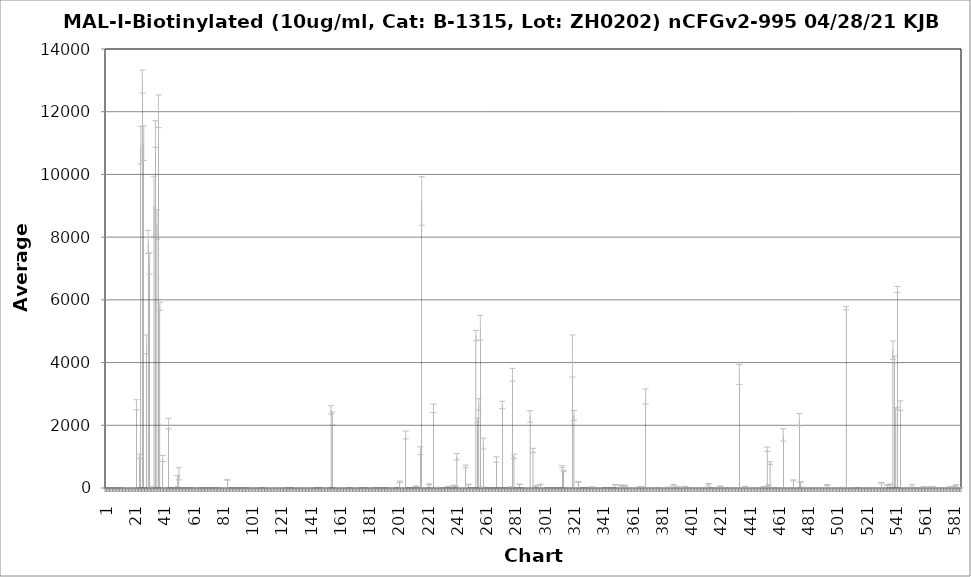
| Category | Average RFU |
|---|---|
| 1.0 | -2.5 |
| 2.0 | -8.25 |
| 3.0 | -2.75 |
| 4.0 | -7.5 |
| 5.0 | -4.25 |
| 6.0 | -10 |
| 7.0 | -8.5 |
| 8.0 | -4 |
| 9.0 | -11.75 |
| 10.0 | -9 |
| 11.0 | -9 |
| 12.0 | -2.5 |
| 13.0 | -4.75 |
| 14.0 | -1.25 |
| 15.0 | -7.5 |
| 16.0 | -4.25 |
| 17.0 | -3 |
| 18.0 | -4 |
| 19.0 | -0.75 |
| 20.0 | -0.25 |
| 21.0 | -8 |
| 22.0 | 2655.25 |
| 23.0 | -2.75 |
| 24.0 | 1009.75 |
| 25.0 | 10933.75 |
| 26.0 | 12960.75 |
| 27.0 | 10995.25 |
| 28.0 | -6.75 |
| 29.0 | 4580.25 |
| 30.0 | 7848 |
| 31.0 | 7163.5 |
| 32.0 | 32 |
| 33.0 | -5.25 |
| 34.0 | 8989 |
| 35.0 | 11289.75 |
| 36.0 | 8401.75 |
| 37.0 | 12013.5 |
| 38.0 | 5795.75 |
| 39.0 | -8.5 |
| 40.0 | 940.5 |
| 41.0 | -0.75 |
| 42.0 | -6 |
| 43.0 | -2.75 |
| 44.0 | 2054.5 |
| 45.0 | -5 |
| 46.0 | -3.75 |
| 47.0 | -8.5 |
| 48.0 | -11.75 |
| 49.0 | -7.25 |
| 50.0 | 216.5 |
| 51.0 | 452.75 |
| 52.0 | -3 |
| 53.0 | -6.75 |
| 54.0 | -4 |
| 55.0 | -7.25 |
| 56.0 | -6.75 |
| 57.0 | -15.5 |
| 58.0 | -1.25 |
| 59.0 | -4 |
| 60.0 | -12.75 |
| 61.0 | -8.5 |
| 62.0 | -5.75 |
| 63.0 | -2 |
| 64.0 | -3.5 |
| 65.0 | -3.25 |
| 66.0 | -6 |
| 67.0 | -8.25 |
| 68.0 | -3 |
| 69.0 | -4.5 |
| 70.0 | -4.5 |
| 71.0 | -2.25 |
| 72.0 | -4.75 |
| 73.0 | -12.25 |
| 74.0 | -4.25 |
| 75.0 | -7.5 |
| 76.0 | -7.25 |
| 77.0 | -6.5 |
| 78.0 | -13 |
| 79.0 | -9 |
| 80.0 | -27 |
| 81.0 | -4.75 |
| 82.0 | 2.5 |
| 83.0 | 5.25 |
| 84.0 | 258 |
| 85.0 | -13.75 |
| 86.0 | -6 |
| 87.0 | -5 |
| 88.0 | -13.25 |
| 89.0 | -8.75 |
| 90.0 | -9.25 |
| 91.0 | -10.75 |
| 92.0 | -7.5 |
| 93.0 | -9 |
| 94.0 | -10 |
| 95.0 | -12.25 |
| 96.0 | -4.75 |
| 97.0 | -2 |
| 98.0 | -2.25 |
| 99.0 | -6.5 |
| 100.0 | -5.5 |
| 101.0 | 19.5 |
| 102.0 | 1.25 |
| 103.0 | -9.5 |
| 104.0 | 1 |
| 105.0 | -7.5 |
| 106.0 | -2.75 |
| 107.0 | -14 |
| 108.0 | -2.75 |
| 109.0 | -4 |
| 110.0 | -3.5 |
| 111.0 | -214 |
| 112.0 | -0.5 |
| 113.0 | -9 |
| 114.0 | -0.5 |
| 115.0 | -16.25 |
| 116.0 | -1 |
| 117.0 | -1 |
| 118.0 | -2.5 |
| 119.0 | -17.75 |
| 120.0 | -3 |
| 121.0 | 1.5 |
| 122.0 | 0.25 |
| 123.0 | -4 |
| 124.0 | -2.75 |
| 125.0 | -4.75 |
| 126.0 | -7.25 |
| 127.0 | -4.75 |
| 128.0 | -6.75 |
| 129.0 | -4.75 |
| 130.0 | -11.25 |
| 131.0 | -3.5 |
| 132.0 | 11.5 |
| 133.0 | -4.25 |
| 134.0 | -128.75 |
| 135.0 | -7.75 |
| 136.0 | -8.25 |
| 137.0 | -0.5 |
| 138.0 | -23.25 |
| 139.0 | -5.5 |
| 140.0 | -5 |
| 141.0 | 2 |
| 142.0 | -82.5 |
| 143.0 | -5 |
| 144.0 | -2.75 |
| 145.0 | -2.25 |
| 146.0 | -5.5 |
| 147.0 | -15.5 |
| 148.0 | -4.75 |
| 149.0 | -9.25 |
| 150.0 | -5.5 |
| 151.0 | -0.25 |
| 152.0 | -2.25 |
| 153.0 | -5 |
| 154.0 | -5.5 |
| 155.0 | 2491.25 |
| 156.0 | 2225 |
| 157.0 | -7 |
| 158.0 | -6 |
| 159.0 | -4.5 |
| 160.0 | 12.75 |
| 161.0 | -1.75 |
| 162.0 | -10 |
| 163.0 | 2.5 |
| 164.0 | 1 |
| 165.0 | -39 |
| 166.0 | -6.75 |
| 167.0 | -2.75 |
| 168.0 | -3 |
| 169.0 | -3.5 |
| 170.0 | -20.25 |
| 171.0 | 0.25 |
| 172.0 | -5.75 |
| 173.0 | -5 |
| 174.0 | -1.5 |
| 175.0 | -7 |
| 176.0 | -5 |
| 177.0 | -4.5 |
| 178.0 | -11.25 |
| 179.0 | -5.5 |
| 180.0 | -8 |
| 181.0 | -7.25 |
| 182.0 | -2.25 |
| 183.0 | -6.5 |
| 184.0 | -4 |
| 185.0 | -12.75 |
| 186.0 | -8.25 |
| 187.0 | -8.25 |
| 188.0 | -140.75 |
| 189.0 | -10.75 |
| 190.0 | -7 |
| 191.0 | -4.75 |
| 192.0 | -11 |
| 193.0 | -5.5 |
| 194.0 | -26.75 |
| 195.0 | -17.75 |
| 196.0 | -8 |
| 197.0 | -3.25 |
| 198.0 | -2.5 |
| 199.0 | -3.75 |
| 200.0 | -3.75 |
| 201.0 | -40.25 |
| 202.0 | 200.5 |
| 203.0 | 0.5 |
| 204.0 | -0.5 |
| 205.0 | -5 |
| 206.0 | 1691 |
| 207.0 | -14 |
| 208.0 | -7.75 |
| 209.0 | -9.25 |
| 210.0 | -10.25 |
| 211.0 | -5.5 |
| 212.0 | -3.25 |
| 213.0 | 54.5 |
| 214.0 | -5 |
| 215.0 | -40 |
| 216.0 | 1189 |
| 217.0 | 9152.75 |
| 218.0 | -8.75 |
| 219.0 | -6.5 |
| 220.0 | -7.5 |
| 221.0 | -19.5 |
| 222.0 | 115.75 |
| 223.0 | -4 |
| 224.0 | 1.5 |
| 225.0 | 2540 |
| 226.0 | -6.25 |
| 227.0 | -4.75 |
| 228.0 | 18.25 |
| 229.0 | -9.75 |
| 230.0 | -8.75 |
| 231.0 | -9.25 |
| 232.0 | -10.5 |
| 233.0 | -13.75 |
| 234.0 | -6 |
| 235.0 | 47.5 |
| 236.0 | -5 |
| 237.0 | -7.75 |
| 238.0 | -6 |
| 239.0 | 84 |
| 240.0 | 55 |
| 241.0 | 1000.5 |
| 242.0 | -12.25 |
| 243.0 | -0.5 |
| 244.0 | -3.25 |
| 245.0 | -5.5 |
| 246.0 | 9.5 |
| 247.0 | 686.5 |
| 248.0 | -2.75 |
| 249.0 | 112.75 |
| 250.0 | -7.75 |
| 251.0 | -8.75 |
| 252.0 | -15.25 |
| 253.0 | -12.75 |
| 254.0 | 4859.5 |
| 255.0 | 2166.25 |
| 256.0 | 2662.25 |
| 257.0 | 5110 |
| 258.0 | 24.75 |
| 259.0 | 1415.25 |
| 260.0 | -5.25 |
| 261.0 | -14.75 |
| 262.0 | -12.75 |
| 263.0 | -16.75 |
| 264.0 | -14.25 |
| 265.0 | -5.75 |
| 266.0 | -10.5 |
| 267.0 | -5.75 |
| 268.0 | 907.5 |
| 269.0 | -1.5 |
| 270.0 | -7 |
| 271.0 | -5.25 |
| 272.0 | 2647.5 |
| 273.0 | -18 |
| 274.0 | -9.25 |
| 275.0 | -15.75 |
| 276.0 | -9 |
| 277.0 | -5.5 |
| 278.0 | 31.5 |
| 279.0 | 3612.25 |
| 280.0 | 1011.5 |
| 281.0 | -9.5 |
| 282.0 | -10 |
| 283.0 | -3.75 |
| 284.0 | 119 |
| 285.0 | -12.75 |
| 286.0 | -18.25 |
| 287.0 | -7.5 |
| 288.0 | 2.75 |
| 289.0 | 0.5 |
| 290.0 | -9.5 |
| 291.0 | 2280.25 |
| 292.0 | -2.5 |
| 293.0 | 1195.25 |
| 294.0 | -0.75 |
| 295.0 | 70 |
| 296.0 | -2.75 |
| 297.0 | -10 |
| 298.0 | 111.75 |
| 299.0 | 6 |
| 300.0 | -6.5 |
| 301.0 | -10.75 |
| 302.0 | -7 |
| 303.0 | -38.25 |
| 304.0 | -11.75 |
| 305.0 | -3.25 |
| 306.0 | -7 |
| 307.0 | -68 |
| 308.0 | -10.75 |
| 309.0 | -7.25 |
| 310.0 | -7.5 |
| 311.0 | -5 |
| 312.0 | -6.25 |
| 313.0 | 683.25 |
| 314.0 | 541.25 |
| 315.0 | -7 |
| 316.0 | 0.75 |
| 317.0 | -5 |
| 318.0 | -5.25 |
| 319.0 | 0.25 |
| 320.0 | 4211.25 |
| 321.0 | 2310.25 |
| 322.0 | -2.5 |
| 323.0 | 16 |
| 324.0 | 186.5 |
| 325.0 | -34 |
| 326.0 | -19.5 |
| 327.0 | -5.5 |
| 328.0 | -14.25 |
| 329.0 | -11 |
| 330.0 | -26.5 |
| 331.0 | -23.25 |
| 332.0 | -45.75 |
| 333.0 | 29.75 |
| 334.0 | -10.25 |
| 335.0 | -9.75 |
| 336.0 | -13.75 |
| 337.0 | -33.5 |
| 338.0 | 10.75 |
| 339.0 | -7.5 |
| 340.0 | -9 |
| 341.0 | -10.75 |
| 342.0 | -16.5 |
| 343.0 | -11 |
| 344.0 | -4.75 |
| 345.0 | -7 |
| 346.0 | -2.25 |
| 347.0 | -105.5 |
| 348.0 | -34.75 |
| 349.0 | 106.75 |
| 350.0 | -2.5 |
| 351.0 | -17.75 |
| 352.0 | 3.5 |
| 353.0 | 86.75 |
| 354.0 | 19.5 |
| 355.0 | 52 |
| 356.0 | 75.25 |
| 357.0 | -17.5 |
| 358.0 | 14.25 |
| 359.0 | -26.5 |
| 360.0 | -86 |
| 361.0 | -4.25 |
| 362.0 | -3.5 |
| 363.0 | 4 |
| 364.0 | -5.5 |
| 365.0 | -3.5 |
| 366.0 | 34.25 |
| 367.0 | -4.75 |
| 368.0 | 31.5 |
| 369.0 | 12.25 |
| 370.0 | 2920 |
| 371.0 | -0.5 |
| 372.0 | -0.75 |
| 373.0 | 0.5 |
| 374.0 | -19.25 |
| 375.0 | -2 |
| 376.0 | -9.5 |
| 377.0 | 0 |
| 378.0 | -1 |
| 379.0 | -5.5 |
| 380.0 | -4 |
| 381.0 | 2.25 |
| 382.0 | -1 |
| 383.0 | 3 |
| 384.0 | 0.25 |
| 385.0 | 1.25 |
| 386.0 | 24.5 |
| 387.0 | 0.75 |
| 388.0 | 1 |
| 389.0 | 100.5 |
| 390.0 | -5.25 |
| 391.0 | -1.75 |
| 392.0 | 37 |
| 393.0 | 12.25 |
| 394.0 | -1.25 |
| 395.0 | 0.75 |
| 396.0 | 0.25 |
| 397.0 | 46.75 |
| 398.0 | -3 |
| 399.0 | -2.75 |
| 400.0 | -2 |
| 401.0 | -4.25 |
| 402.0 | -0.75 |
| 403.0 | 0.5 |
| 404.0 | 1.5 |
| 405.0 | -1 |
| 406.0 | -3 |
| 407.0 | 0 |
| 408.0 | -1 |
| 409.0 | -1 |
| 410.0 | -1.5 |
| 411.0 | -0.25 |
| 412.0 | 6.5 |
| 413.0 | 121.25 |
| 414.0 | -24.75 |
| 415.0 | -2.5 |
| 416.0 | -4.5 |
| 417.0 | 0 |
| 418.0 | -1.5 |
| 419.0 | 4.75 |
| 420.0 | 1 |
| 421.0 | 56 |
| 422.0 | -2.25 |
| 423.0 | 9 |
| 424.0 | -2 |
| 425.0 | -5.75 |
| 426.0 | -7.5 |
| 427.0 | -20.75 |
| 428.0 | 3 |
| 429.0 | -0.25 |
| 430.0 | 3.5 |
| 431.0 | -2.5 |
| 432.0 | 1.25 |
| 433.0 | 1.5 |
| 434.0 | 3619.5 |
| 435.0 | -5 |
| 436.0 | -3.25 |
| 437.0 | -55.75 |
| 438.0 | 45.25 |
| 439.0 | 9 |
| 440.0 | -1 |
| 441.0 | 0.5 |
| 442.0 | 0 |
| 443.0 | 4.25 |
| 444.0 | -1.75 |
| 445.0 | -17.5 |
| 446.0 | 1.75 |
| 447.0 | 2.25 |
| 448.0 | 3.5 |
| 449.0 | -5.75 |
| 450.0 | 22 |
| 451.0 | 42.25 |
| 452.0 | 15.25 |
| 453.0 | 1235 |
| 454.0 | 88.25 |
| 455.0 | 795.5 |
| 456.0 | -1.5 |
| 457.0 | -5 |
| 458.0 | -4 |
| 459.0 | -14.5 |
| 460.0 | 0 |
| 461.0 | -14 |
| 462.0 | 1.5 |
| 463.0 | 2.75 |
| 464.0 | 1694 |
| 465.0 | 13 |
| 466.0 | 2.5 |
| 467.0 | -0.5 |
| 468.0 | 2.5 |
| 469.0 | -2.25 |
| 470.0 | 0.25 |
| 471.0 | 244.5 |
| 472.0 | 3 |
| 473.0 | 0.5 |
| 474.0 | -1.75 |
| 475.0 | 2179 |
| 476.0 | 192 |
| 477.0 | -8.75 |
| 478.0 | 20 |
| 479.0 | -0.25 |
| 480.0 | 1.5 |
| 481.0 | -2 |
| 482.0 | 1.25 |
| 483.0 | -22.25 |
| 484.0 | -3.5 |
| 485.0 | -0.75 |
| 486.0 | -29.5 |
| 487.0 | -1.25 |
| 488.0 | 0.25 |
| 489.0 | -3.25 |
| 490.0 | 0.5 |
| 491.0 | 1.75 |
| 492.0 | -2.75 |
| 493.0 | 6.75 |
| 494.0 | 92.75 |
| 495.0 | -3.25 |
| 496.0 | 0.25 |
| 497.0 | -2.25 |
| 498.0 | -9.75 |
| 499.0 | -5.75 |
| 500.0 | -5 |
| 501.0 | -1.25 |
| 502.0 | -5.5 |
| 503.0 | -1.5 |
| 504.0 | 18.25 |
| 505.0 | 5.5 |
| 506.0 | -13.5 |
| 507.0 | 5734 |
| 508.0 | 1.25 |
| 509.0 | 1 |
| 510.0 | -19.5 |
| 511.0 | -3 |
| 512.0 | 0.75 |
| 513.0 | -10.75 |
| 514.0 | -1.75 |
| 515.0 | -2.5 |
| 516.0 | -3 |
| 517.0 | 0.25 |
| 518.0 | -1.5 |
| 519.0 | 2.25 |
| 520.0 | -2 |
| 521.0 | 1 |
| 522.0 | -5.25 |
| 523.0 | -5 |
| 524.0 | -6.75 |
| 525.0 | 4.75 |
| 526.0 | -3.25 |
| 527.0 | -4 |
| 528.0 | -6.75 |
| 529.0 | -0.25 |
| 530.0 | -0.75 |
| 531.0 | 167 |
| 532.0 | -3.25 |
| 533.0 | -1.25 |
| 534.0 | -9.75 |
| 535.0 | 91 |
| 536.0 | -7.25 |
| 537.0 | 112.75 |
| 538.0 | -3.5 |
| 539.0 | 4396 |
| 540.0 | 4092.75 |
| 541.0 | 2535.5 |
| 542.0 | 6330.5 |
| 543.0 | -3 |
| 544.0 | 2625.25 |
| 545.0 | -10 |
| 546.0 | -11.75 |
| 547.0 | -0.5 |
| 548.0 | -2 |
| 549.0 | -2.25 |
| 550.0 | -5.5 |
| 551.0 | 1 |
| 552.0 | 69.75 |
| 553.0 | -2.5 |
| 554.0 | -3 |
| 555.0 | -1.25 |
| 556.0 | 3.75 |
| 557.0 | -5.5 |
| 558.0 | 0.5 |
| 559.0 | 1 |
| 560.0 | 38.5 |
| 561.0 | 1.25 |
| 562.0 | 16.5 |
| 563.0 | 3.5 |
| 564.0 | 5.25 |
| 565.0 | 35.5 |
| 566.0 | 36.75 |
| 567.0 | 1.75 |
| 568.0 | -13.75 |
| 569.0 | -1.25 |
| 570.0 | 1.5 |
| 571.0 | -29.75 |
| 572.0 | 0.75 |
| 573.0 | -3.25 |
| 574.0 | -4.75 |
| 575.0 | 1.75 |
| 576.0 | 3.75 |
| 577.0 | -1.75 |
| 578.0 | 34.75 |
| 579.0 | 0.5 |
| 580.0 | 2.25 |
| 581.0 | 38 |
| 582.0 | 93.5 |
| 583.0 | 11.25 |
| 584.0 | -6.5 |
| 585.0 | 11.5 |